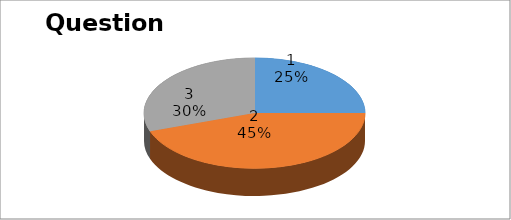
| Category | Series 0 |
|---|---|
| 0 | 14 |
| 1 | 25 |
| 2 | 17 |